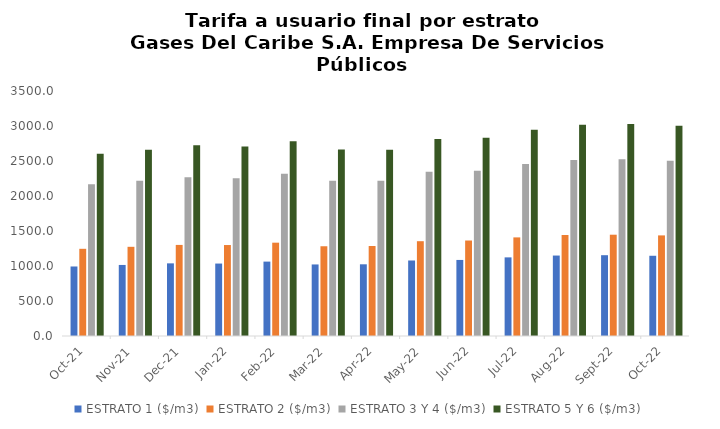
| Category | ESTRATO 1 ($/m3) | ESTRATO 2 ($/m3) | ESTRATO 3 Y 4 ($/m3) | ESTRATO 5 Y 6 ($/m3) |
|---|---|---|---|---|
| 2021-10-01 | 993.08 | 1245.57 | 2169.09 | 2602.908 |
| 2021-11-01 | 1015 | 1274.13 | 2217.49 | 2660.988 |
| 2021-12-01 | 1037.76 | 1301.16 | 2269.54 | 2723.448 |
| 2022-01-01 | 1034.96 | 1299.58 | 2255.09 | 2706.108 |
| 2022-02-01 | 1062.79 | 1333.18 | 2319.47 | 2783.364 |
| 2022-03-01 | 1022.16 | 1282.17 | 2218.76 | 2662.512 |
| 2022-04-01 | 1024.32 | 1285.33 | 2218.09 | 2661.708 |
| 2022-05-01 | 1078.73 | 1354.26 | 2345.47 | 2814.564 |
| 2022-06-01 | 1086.51 | 1364.12 | 2359 | 2830.8 |
| 2022-07-01 | 1123.27 | 1408.66 | 2455.61 | 2946.732 |
| 2022-08-01 | 1149.36 | 1442.77 | 2514.15 | 3016.98 |
| 2022-09-01 | 1154.32 | 1447.01 | 2525.28 | 3030.336 |
| 2022-10-01 | 1146.18 | 1437.12 | 2503.54 | 3004.248 |